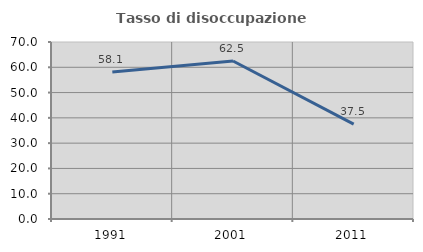
| Category | Tasso di disoccupazione giovanile  |
|---|---|
| 1991.0 | 58.108 |
| 2001.0 | 62.5 |
| 2011.0 | 37.5 |